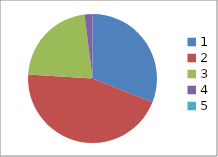
| Category | Series 0 |
|---|---|
| 0 | 0.31 |
| 1 | 0.45 |
| 2 | 0.22 |
| 3 | 0.02 |
| 4 | 0 |